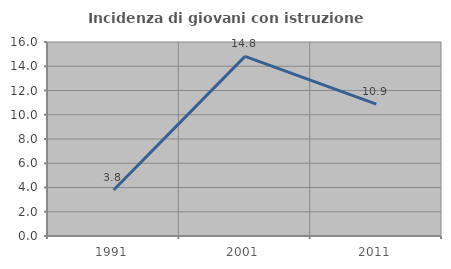
| Category | Incidenza di giovani con istruzione universitaria |
|---|---|
| 1991.0 | 3.797 |
| 2001.0 | 14.815 |
| 2011.0 | 10.87 |